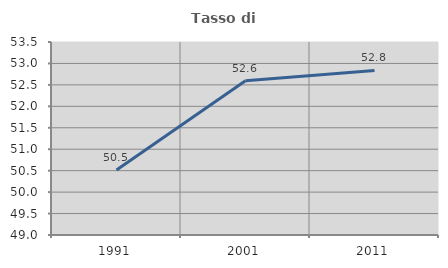
| Category | Tasso di occupazione   |
|---|---|
| 1991.0 | 50.514 |
| 2001.0 | 52.598 |
| 2011.0 | 52.837 |